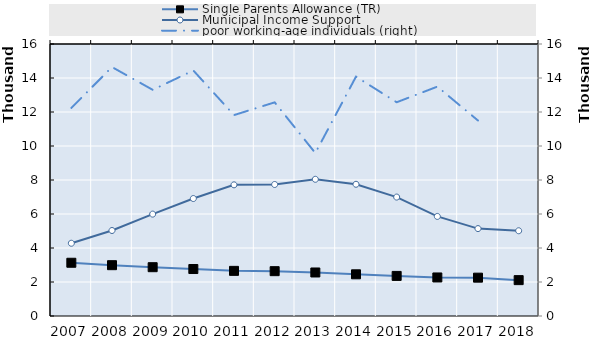
| Category | Single Parents Allowance (TR) | Municipal Income Support |
|---|---|---|
| 2007.0 | 3132 | 4280 |
| 2008.0 | 2989 | 5029 |
| 2009.0 | 2871 | 5994 |
| 2010.0 | 2763 | 6910 |
| 2011.0 | 2655 | 7715 |
| 2012.0 | 2637 | 7736 |
| 2013.0 | 2560 | 8042 |
| 2014.0 | 2453 | 7749 |
| 2015.0 | 2358 | 6996 |
| 2016.0 | 2267 | 5858 |
| 2017.0 | 2255 | 5142 |
| 2018.0 | 2110 | 5014 |